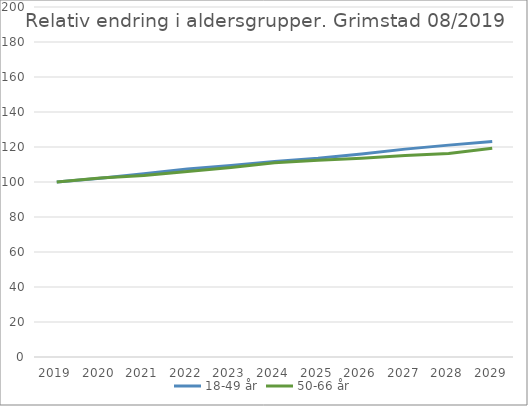
| Category | 18-49 år | 50-66 år |
|---|---|---|
| 2019 | 100 | 100 |
| 2020 | 102.173 | 102.329 |
| 2021 | 104.758 | 103.696 |
| 2022 | 107.429 | 106.061 |
| 2023 | 109.402 | 108.252 |
| 2024 | 111.693 | 111.053 |
| 2025 | 113.556 | 112.386 |
| 2026 | 115.983 | 113.582 |
| 2027 | 118.791 | 115.143 |
| 2028 | 121.075 | 116.261 |
| 2029 | 123.132 | 119.285 |